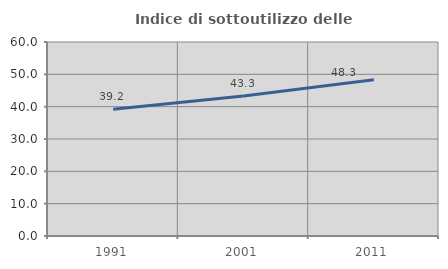
| Category | Indice di sottoutilizzo delle abitazioni  |
|---|---|
| 1991.0 | 39.184 |
| 2001.0 | 43.3 |
| 2011.0 | 48.34 |